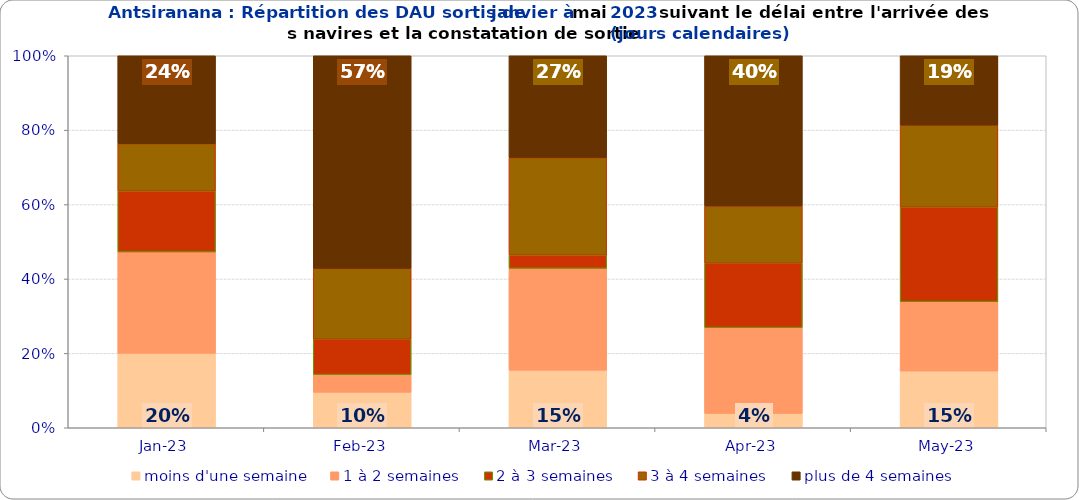
| Category | moins d'une semaine | 1 à 2 semaines | 2 à 3 semaines | 3 à 4 semaines | plus de 4 semaines |
|---|---|---|---|---|---|
| 2023-01-01 | 0.2 | 0.273 | 0.164 | 0.127 | 0.236 |
| 2023-02-01 | 0.095 | 0.048 | 0.095 | 0.19 | 0.571 |
| 2023-03-01 | 0.155 | 0.274 | 0.036 | 0.262 | 0.274 |
| 2023-04-01 | 0.038 | 0.231 | 0.173 | 0.154 | 0.404 |
| 2023-05-01 | 0.153 | 0.186 | 0.254 | 0.22 | 0.186 |